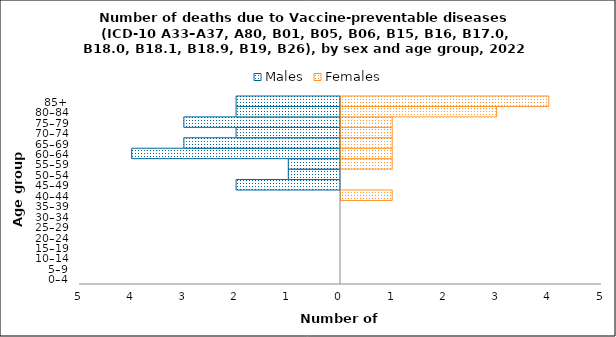
| Category | Males | Females |
|---|---|---|
| 0–4 | 0 | 0 |
| 5–9 | 0 | 0 |
| 10–14 | 0 | 0 |
| 15–19 | 0 | 0 |
| 20–24 | 0 | 0 |
| 25–29 | 0 | 0 |
| 30–34 | 0 | 0 |
| 35–39 | 0 | 0 |
| 40–44 | 0 | 1 |
| 45–49 | -2 | 0 |
| 50–54 | -1 | 0 |
| 55–59 | -1 | 1 |
| 60–64 | -4 | 1 |
| 65–69 | -3 | 1 |
| 70–74 | -2 | 1 |
| 75–79 | -3 | 1 |
| 80–84 | -2 | 3 |
| 85+ | -2 | 4 |